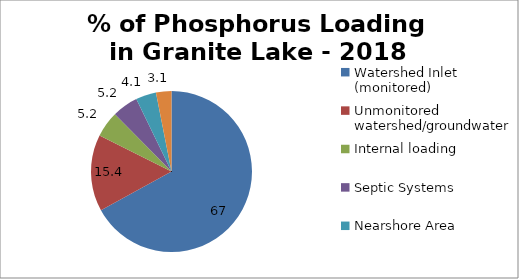
| Category | Series 0 |
|---|---|
| Watershed Inlet (monitored) | 67 |
| Unmonitored watershed/groundwater | 15.4 |
| Internal loading  | 5.2 |
| Septic Systems | 5.2 |
| Nearshore Area | 4.1 |
| Atmospheric | 3.1 |